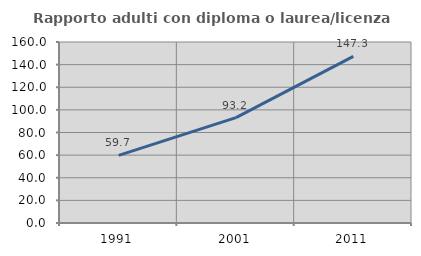
| Category | Rapporto adulti con diploma o laurea/licenza media  |
|---|---|
| 1991.0 | 59.732 |
| 2001.0 | 93.185 |
| 2011.0 | 147.321 |